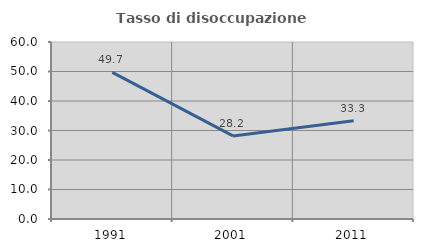
| Category | Tasso di disoccupazione giovanile  |
|---|---|
| 1991.0 | 49.693 |
| 2001.0 | 28.155 |
| 2011.0 | 33.333 |